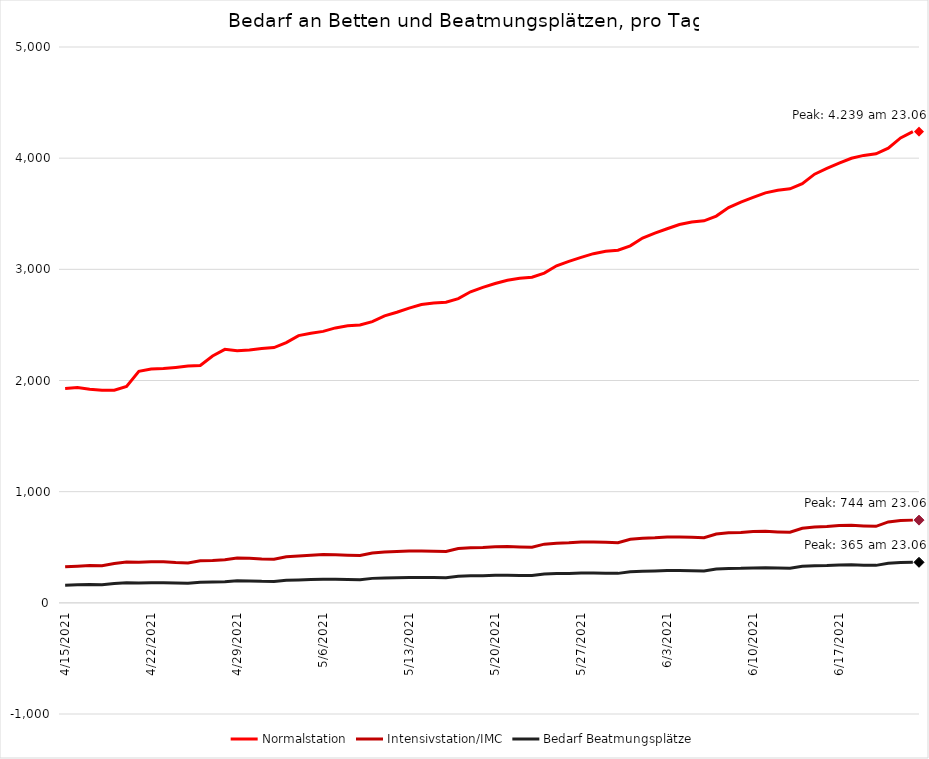
| Category | Normalstation | Intensivstation/IMC | Bedarf Beatmungsplätze |
|---|---|---|---|
| 4/15/21 | 1928 | 324 | 158.76 |
| 4/16/21 | 1937 | 330 | 161.7 |
| 4/17/21 | 1922 | 335 | 164.15 |
| 4/18/21 | 1912 | 333 | 163.17 |
| 4/19/21 | 1912 | 353 | 172.97 |
| 4/20/21 | 1946 | 367 | 179.83 |
| 4/21/21 | 2082 | 365 | 178.85 |
| 4/22/21 | 2103 | 370 | 181.3 |
| 4/23/21 | 2108 | 370 | 181.3 |
| 4/24/21 | 2118 | 363 | 177.87 |
| 4/25/21 | 2130 | 359 | 175.91 |
| 4/26/21 | 2135 | 378 | 185.22 |
| 4/27/21 | 2220 | 381 | 186.69 |
| 4/28/21 | 2280 | 388 | 190.12 |
| 4/29/21 | 2267 | 404 | 197.96 |
| 4/30/21 | 2275 | 401 | 196.49 |
| 5/1/21 | 2288 | 394 | 193.06 |
| 5/2/21 | 2296 | 392 | 192.08 |
| 5/3/21 | 2341 | 415 | 203.35 |
| 5/4/21 | 2404 | 421 | 206.29 |
| 5/5/21 | 2425 | 427 | 209.23 |
| 5/6/21 | 2442 | 434 | 212.66 |
| 5/7/21 | 2473 | 432 | 211.68 |
| 5/8/21 | 2492 | 428 | 209.72 |
| 5/9/21 | 2499 | 425 | 208.25 |
| 5/10/21 | 2530 | 449 | 220.01 |
| 5/11/21 | 2581 | 458 | 224.42 |
| 5/12/21 | 2614 | 461 | 225.89 |
| 5/13/21 | 2651 | 466 | 228.34 |
| 5/14/21 | 2683 | 467 | 228.83 |
| 5/15/21 | 2698 | 464 | 227.36 |
| 5/16/21 | 2704 | 462 | 226.38 |
| 5/17/21 | 2736 | 488 | 239.12 |
| 5/18/21 | 2798 | 495 | 242.55 |
| 5/19/21 | 2838 | 498 | 244.02 |
| 5/20/21 | 2872 | 505 | 247.45 |
| 5/21/21 | 2902 | 506 | 247.94 |
| 5/22/21 | 2919 | 503 | 246.47 |
| 5/23/21 | 2929 | 500 | 245 |
| 5/24/21 | 2966 | 528 | 258.72 |
| 5/25/21 | 3032 | 537 | 263.13 |
| 5/26/21 | 3072 | 540 | 264.6 |
| 5/27/21 | 3107 | 547 | 268.03 |
| 5/28/21 | 3141 | 548 | 268.52 |
| 5/29/21 | 3162 | 544 | 266.56 |
| 5/30/21 | 3172 | 541 | 265.09 |
| 5/31/21 | 3211 | 572 | 280.28 |
| 6/1/21 | 3282 | 581 | 284.69 |
| 6/2/21 | 3326 | 585 | 286.65 |
| 6/3/21 | 3365 | 592 | 290.08 |
| 6/4/21 | 3403 | 593 | 290.57 |
| 6/5/21 | 3425 | 589 | 288.61 |
| 6/6/21 | 3436 | 586 | 287.14 |
| 6/7/21 | 3479 | 619 | 303.31 |
| 6/8/21 | 3556 | 630 | 308.7 |
| 6/9/21 | 3605 | 633 | 310.17 |
| 6/10/21 | 3647 | 641 | 314.09 |
| 6/11/21 | 3688 | 643 | 315.07 |
| 6/12/21 | 3712 | 638 | 312.62 |
| 6/13/21 | 3724 | 635 | 311.15 |
| 6/14/21 | 3771 | 671 | 328.79 |
| 6/15/21 | 3856 | 682 | 334.18 |
| 6/16/21 | 3908 | 686 | 336.14 |
| 6/17/21 | 3955 | 695 | 340.55 |
| 6/18/21 | 3999 | 697 | 341.53 |
| 6/19/21 | 4025 | 692 | 339.08 |
| 6/20/21 | 4039 | 688 | 337.12 |
| 6/21/21 | 4090 | 728 | 356.72 |
| 6/22/21 | 4182 | 740 | 362.6 |
| 6/23/21 | 4239 | 744 | 364.56 |